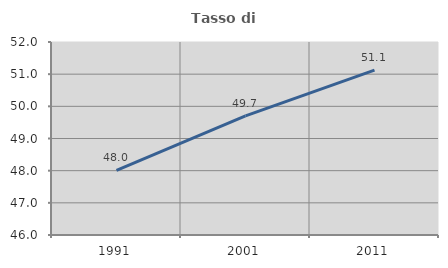
| Category | Tasso di occupazione   |
|---|---|
| 1991.0 | 48.013 |
| 2001.0 | 49.706 |
| 2011.0 | 51.127 |